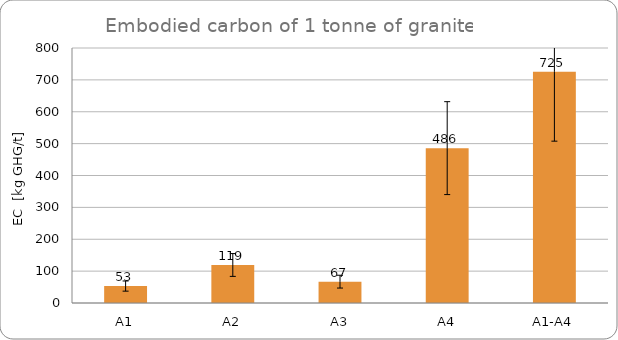
| Category | Series 0 |
|---|---|
| A1 | 53.1 |
| A2 | 119.32 |
| A3 | 67 |
| A4 | 485.88 |
| A1-A4 | 725.3 |